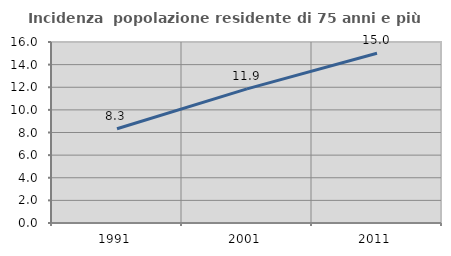
| Category | Incidenza  popolazione residente di 75 anni e più |
|---|---|
| 1991.0 | 8.333 |
| 2001.0 | 11.855 |
| 2011.0 | 15 |